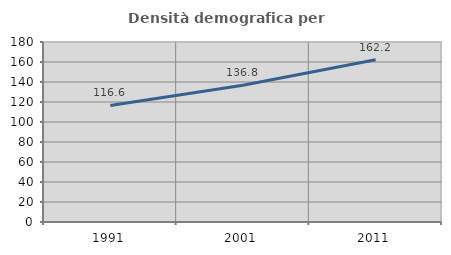
| Category | Densità demografica |
|---|---|
| 1991.0 | 116.576 |
| 2001.0 | 136.786 |
| 2011.0 | 162.171 |